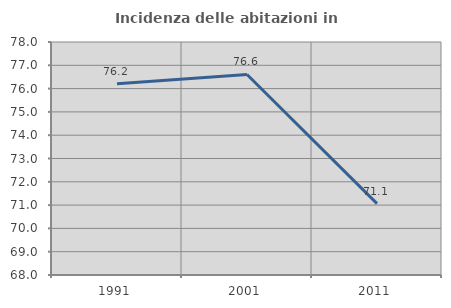
| Category | Incidenza delle abitazioni in proprietà  |
|---|---|
| 1991.0 | 76.207 |
| 2001.0 | 76.606 |
| 2011.0 | 71.062 |